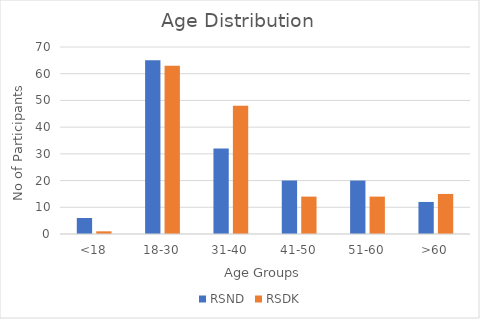
| Category | RSND | RSDK |
|---|---|---|
| <18 | 6 | 1 |
| 18-30 | 65 | 63 |
| 31-40 | 32 | 48 |
| 41-50 | 20 | 14 |
| 51-60 | 20 | 14 |
| >60 | 12 | 15 |